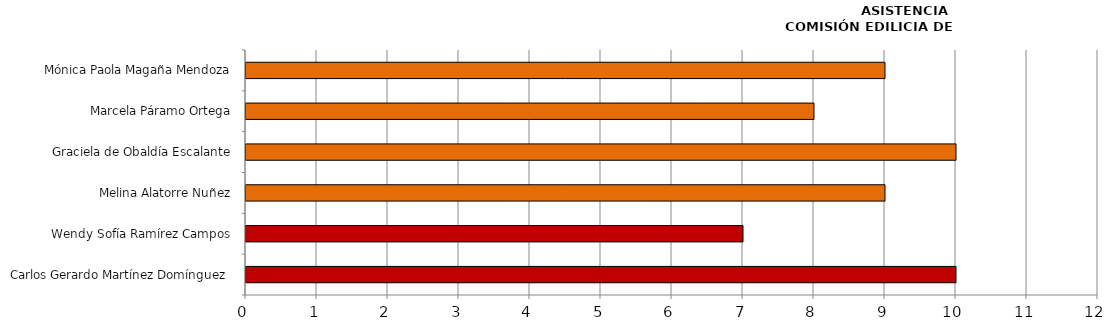
| Category | Series 0 |
|---|---|
| Carlos Gerardo Martínez Domínguez  | 10 |
| Wendy Sofía Ramírez Campos | 7 |
| Melina Alatorre Nuñez | 9 |
| Graciela de Obaldía Escalante | 10 |
| Marcela Páramo Ortega | 8 |
| Mónica Paola Magaña Mendoza | 9 |